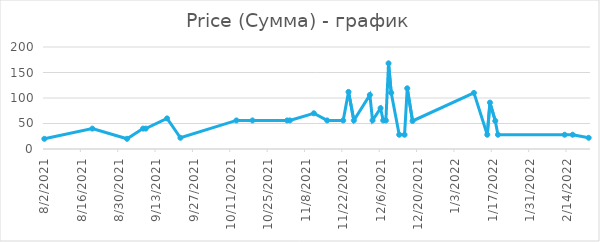
| Category | Price (Сумма) |
|---|---|
| 8/2/21 | 20 |
| 8/20/21 | 40 |
| 9/2/21 | 20 |
| 9/8/21 | 40 |
| 9/9/21 | 40 |
| 9/17/21 | 60 |
| 9/22/21 | 22 |
| 10/13/21 | 56 |
| 10/19/21 | 56 |
| 11/1/21 | 56 |
| 11/2/21 | 56 |
| 11/11/21 | 70 |
| 11/16/21 | 56 |
| 11/22/21 | 56 |
| 11/24/21 | 112 |
| 11/26/21 | 56 |
| 12/2/21 | 106 |
| 12/3/21 | 56 |
| 12/6/21 | 80 |
| 12/7/21 | 56 |
| 12/8/21 | 56 |
| 12/9/21 | 168 |
| 12/10/21 | 110 |
| 12/13/21 | 28 |
| 12/15/21 | 28 |
| 12/16/21 | 119 |
| 12/18/21 | 55 |
| 1/10/22 | 110 |
| 1/15/22 | 28 |
| 1/16/22 | 91 |
| 1/18/22 | 55 |
| 1/19/22 | 28 |
| 2/13/22 | 28 |
| 2/16/22 | 28 |
| 2/22/22 | 22 |